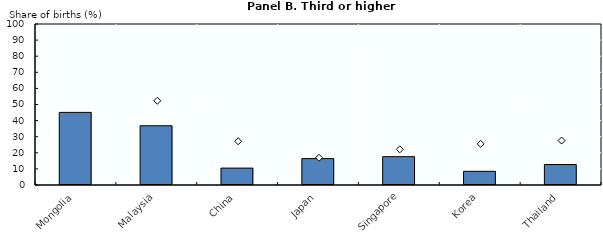
| Category | 2013 ↘ |
|---|---|
| Mongolia | 45.1 |
| Malaysia | 36.8 |
| China | 10.5 |
| Japan | 16.4 |
| Singapore | 17.6 |
| Korea | 8.5 |
| Thailand | 12.7 |